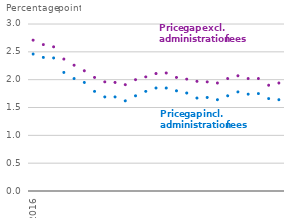
| Category | Price gap incl. administration fees | Price gap excl. administration fees |
|---|---|---|
| 2016-01-01 | 2.46 | 2.71 |
| 2016-02-01 | 2.4 | 2.63 |
| 2016-03-01 | 2.39 | 2.59 |
| 2016-04-01 | 2.13 | 2.37 |
| 2016-05-01 | 2.02 | 2.26 |
| 2016-06-01 | 1.95 | 2.16 |
| 2016-07-01 | 1.79 | 2.04 |
| 2016-08-01 | 1.69 | 1.96 |
| 2016-09-01 | 1.69 | 1.95 |
| 2016-10-01 | 1.62 | 1.91 |
| 2016-11-01 | 1.71 | 2 |
| 2016-12-01 | 1.79 | 2.05 |
| 2017-01-01 | 1.85 | 2.11 |
| 2017-02-01 | 1.85 | 2.12 |
| 2017-03-01 | 1.8 | 2.04 |
| 2017-04-01 | 1.76 | 2.01 |
| 2017-05-01 | 1.67 | 1.97 |
| 2017-06-01 | 1.68 | 1.96 |
| 2017-07-01 | 1.64 | 1.94 |
| 2017-08-01 | 1.71 | 2.02 |
| 2017-09-01 | 1.78 | 2.07 |
| 2017-10-01 | 1.74 | 2.02 |
| 2017-11-01 | 1.75 | 2.02 |
| 2017-12-01 | 1.66 | 1.9 |
| 2018-01-01 | 1.64 | 1.94 |